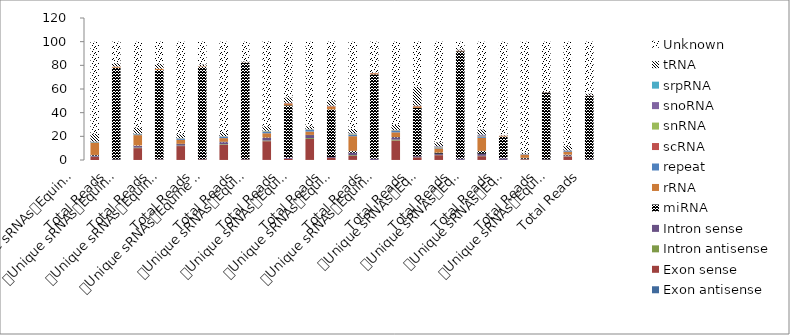
| Category | Exon antisense | Exon sense | Intron antisense | Intron sense | miRNA | rRNA | repeat | scRNA | snRNA | snoRNA | srpRNA | tRNA | Unknown |
|---|---|---|---|---|---|---|---|---|---|---|---|---|---|
| 0 | 0.019 | 2.527 | 0.265 | 0.889 | 0.569 | 10.087 | 0.539 | 0.077 | 0.28 | 0.264 | 0.078 | 6.564 | 77.842 |
| 1 | 0 | 0.057 | 0.018 | 0.337 | 77.598 | 0.815 | 0.021 | 0.107 | 0.047 | 0.031 | 0.01 | 2.828 | 18.13 |
| 2 | 0.03 | 10.005 | 0.473 | 1.265 | 0.502 | 8.736 | 0.73 | 0.06 | 0.203 | 0.19 | 0.069 | 5.013 | 72.723 |
| 3 | 0.001 | 0.251 | 0.021 | 0.298 | 75.487 | 0.988 | 0.023 | 0.03 | 0.04 | 0.015 | 0.027 | 4.159 | 18.659 |
| 4 | 0.039 | 11.733 | 0.381 | 1.19 | 0.336 | 3.332 | 0.895 | 0.047 | 0.269 | 0.174 | 0.076 | 3.363 | 78.165 |
| 5 | 0.002 | 0.459 | 0.023 | 0.255 | 77.94 | 0.467 | 0.042 | 0.031 | 0.019 | 0.027 | 0.029 | 1.521 | 19.185 |
| 6 | 0.039 | 12.832 | 0.493 | 1.696 | 0.383 | 3.044 | 1.137 | 0.053 | 0.235 | 0.169 | 0.055 | 2.585 | 77.279 |
| 7 | 0.002 | 0.395 | 0.029 | 0.273 | 81.335 | 0.242 | 0.044 | 0.03 | 0.011 | 0.015 | 0.007 | 0.863 | 16.755 |
| 8 | 0.072 | 15.817 | 0.562 | 2.228 | 0.337 | 3.571 | 1.351 | 0.056 | 0.403 | 0.284 | 0.108 | 3.724 | 71.73 |
| 9 | 0.004 | 0.955 | 0.038 | 0.728 | 44.463 | 1.353 | 0.092 | 0.449 | 0.091 | 0.112 | 0.136 | 4.586 | 46.994 |
| 10 | 0.06 | 17.696 | 0.757 | 2.463 | 0.241 | 2.807 | 1.471 | 0.043 | 0.267 | 0.193 | 0.077 | 2.405 | 71.521 |
| 11 | 0.004 | 1.72 | 0.125 | 0.699 | 40.225 | 2.49 | 0.125 | 0.263 | 0.086 | 0.079 | 0.202 | 4.577 | 49.438 |
| 12 | 0.085 | 3.379 | 0.621 | 1.992 | 1.755 | 12.284 | 1.084 | 0.177 | 0.448 | 0.522 | 0.197 | 3.71 | 73.745 |
| 13 | 0.001 | 0.041 | 0.011 | 1.011 | 71.342 | 0.892 | 0.018 | 0.154 | 0.024 | 0.07 | 0.006 | 0.442 | 25.988 |
| 14 | 0.043 | 16.43 | 0.746 | 1.88 | 0.326 | 3.94 | 1.301 | 0.056 | 0.39 | 0.283 | 0.072 | 4.302 | 70.231 |
| 15 | 0.004 | 2.211 | 0.145 | 0.886 | 40.814 | 1.293 | 0.134 | 0.189 | 0.091 | 0.118 | 0.098 | 15.989 | 38.029 |
| 16 | 0.034 | 4.041 | 0.242 | 1.002 | 0.936 | 3.535 | 0.658 | 0.126 | 0.339 | 0.6 | 0.085 | 3.485 | 84.917 |
| 17 | 0.001 | 0.088 | 0.011 | 0.943 | 90.863 | 0.336 | 0.025 | 0.112 | 0.024 | 0.124 | 0.005 | 1.059 | 6.409 |
| 18 | 0.053 | 3.159 | 0.37 | 1.684 | 2.505 | 11.006 | 1.084 | 0.227 | 0.483 | 0.762 | 0.206 | 4.398 | 74.064 |
| 19 | 0.001 | 0.05 | 0.011 | 1.348 | 18.452 | 0.651 | 0.02 | 0.084 | 0.027 | 0.097 | 0.005 | 0.628 | 78.626 |
| 20 | 0.018 | 0.575 | 0.102 | 0.418 | 0.739 | 2.493 | 0.279 | 0.075 | 0.154 | 0.323 | 0.049 | 1.091 | 93.685 |
| 21 | 0 | 0.013 | 0.004 | 0.418 | 56.73 | 0.127 | 0.014 | 0.035 | 0.011 | 0.056 | 0.001 | 0.148 | 42.444 |
| 22 | 0.033 | 2.97 | 0.208 | 0.718 | 0.62 | 2.351 | 0.618 | 0.074 | 0.238 | 0.343 | 0.043 | 3.566 | 88.216 |
| 23 | 0.001 | 0.081 | 0.008 | 0.432 | 53.52 | 0.161 | 0.025 | 0.051 | 0.015 | 0.09 | 0.006 | 1.856 | 43.756 |